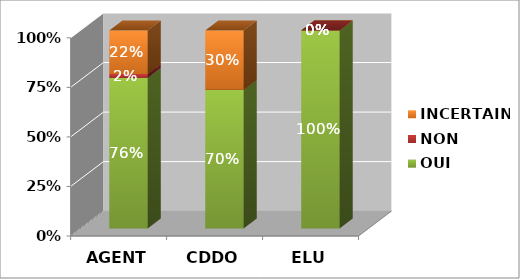
| Category | OUI | NON | INCERTAIN |
|---|---|---|---|
| AGENT | 0.76 | 0.02 | 0.22 |
| CDDO | 0.7 | 0 | 0.3 |
| ELU | 1 | 0 | 0 |